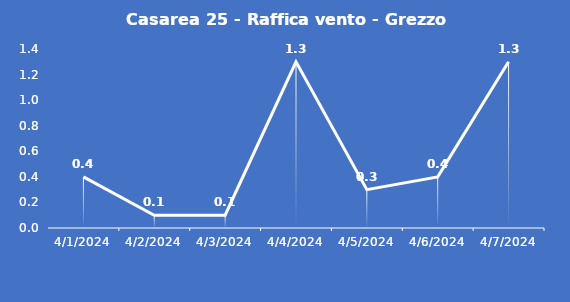
| Category | Casarea 25 - Raffica vento - Grezzo (m/s) |
|---|---|
| 4/1/24 | 0.4 |
| 4/2/24 | 0.1 |
| 4/3/24 | 0.1 |
| 4/4/24 | 1.3 |
| 4/5/24 | 0.3 |
| 4/6/24 | 0.4 |
| 4/7/24 | 1.3 |